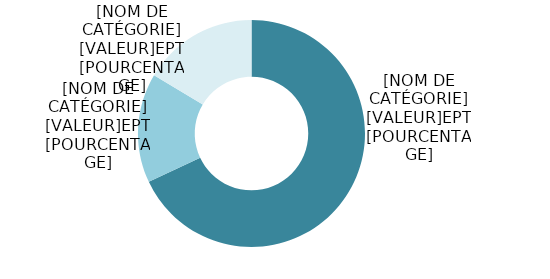
| Category | Series 0 |
|---|---|
| DIP | 3227.895 |
| FNS | 738.869 |
| Autres fonds | 780.326 |